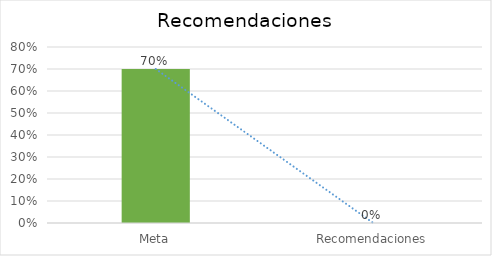
| Category | Series 0 |
|---|---|
| Meta | 0.7 |
| Recomendaciones | 0 |